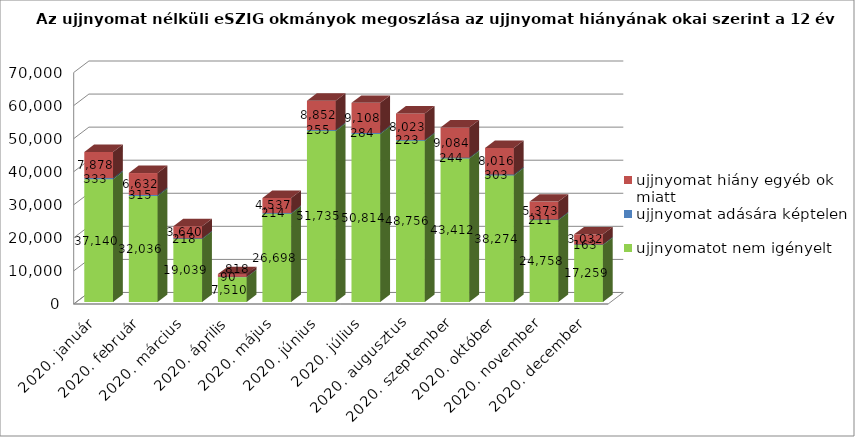
| Category | ujjnyomatot nem igényelt | ujjnyomat adására képtelen | ujjnyomat hiány egyéb ok miatt |
|---|---|---|---|
| 2020. január | 37140 | 333 | 7878 |
| 2020. február | 32036 | 315 | 6632 |
| 2020. március | 19039 | 218 | 3640 |
| 2020. április | 7510 | 90 | 818 |
| 2020. május | 26698 | 214 | 4537 |
| 2020. június | 51735 | 255 | 8852 |
| 2020. július | 50814 | 284 | 9108 |
| 2020. augusztus | 48756 | 223 | 8023 |
| 2020. szeptember | 43412 | 244 | 9084 |
| 2020. október | 38274 | 303 | 8016 |
| 2020. november | 24758 | 211 | 5373 |
| 2020. december | 17259 | 163 | 3032 |